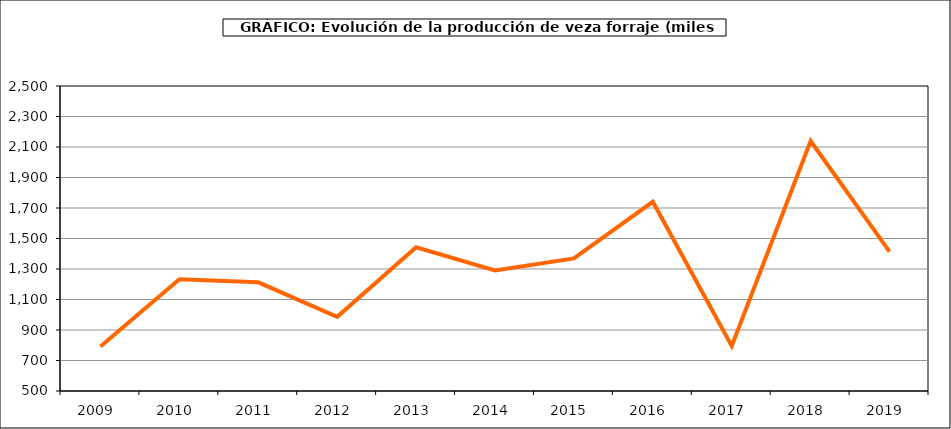
| Category | Producción |
|---|---|
| 2009.0 | 791.875 |
| 2010.0 | 1232.646 |
| 2011.0 | 1212.426 |
| 2012.0 | 986.263 |
| 2013.0 | 1442.069 |
| 2014.0 | 1290.565 |
| 2015.0 | 1369.532 |
| 2016.0 | 1740.854 |
| 2017.0 | 794.791 |
| 2018.0 | 2139.418 |
| 2019.0 | 1413.909 |